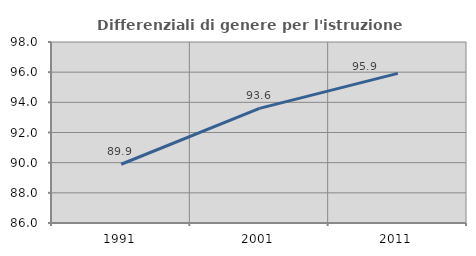
| Category | Differenziali di genere per l'istruzione superiore |
|---|---|
| 1991.0 | 89.894 |
| 2001.0 | 93.599 |
| 2011.0 | 95.921 |